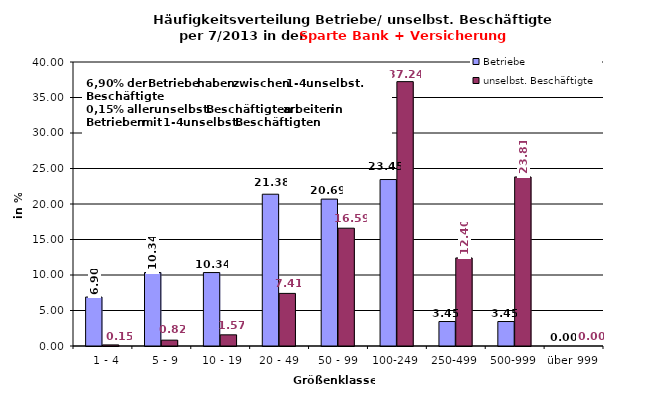
| Category | Betriebe | unselbst. Beschäftigte |
|---|---|---|
|   1 - 4 | 6.897 | 0.153 |
|   5 - 9 | 10.345 | 0.823 |
|  10 - 19 | 10.345 | 1.573 |
| 20 - 49 | 21.379 | 7.408 |
| 50 - 99 | 20.69 | 16.593 |
| 100-249 | 23.448 | 37.235 |
| 250-499 | 3.448 | 12.404 |
| 500-999 | 3.448 | 23.811 |
| über 999 | 0 | 0 |